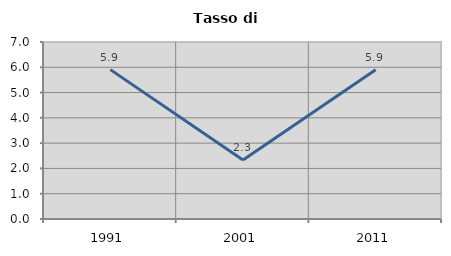
| Category | Tasso di disoccupazione   |
|---|---|
| 1991.0 | 5.907 |
| 2001.0 | 2.333 |
| 2011.0 | 5.9 |